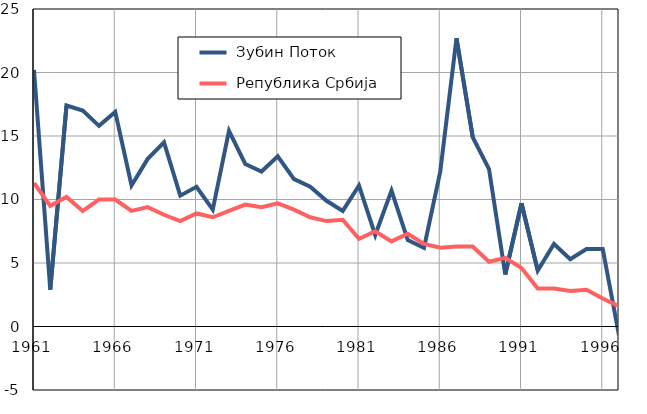
| Category |  Зубин Поток |  Република Србија |
|---|---|---|
| 1961.0 | 20.2 | 11.3 |
| 1962.0 | 2.9 | 9.5 |
| 1963.0 | 17.4 | 10.2 |
| 1964.0 | 17 | 9.1 |
| 1965.0 | 15.8 | 10 |
| 1966.0 | 16.9 | 10 |
| 1967.0 | 11.1 | 9.1 |
| 1968.0 | 13.2 | 9.4 |
| 1969.0 | 14.5 | 8.8 |
| 1970.0 | 10.3 | 8.3 |
| 1971.0 | 11 | 8.9 |
| 1972.0 | 9.2 | 8.6 |
| 1973.0 | 15.4 | 9.1 |
| 1974.0 | 12.8 | 9.6 |
| 1975.0 | 12.2 | 9.4 |
| 1976.0 | 13.4 | 9.7 |
| 1977.0 | 11.6 | 9.2 |
| 1978.0 | 11 | 8.6 |
| 1979.0 | 9.9 | 8.3 |
| 1980.0 | 9.1 | 8.4 |
| 1981.0 | 11.1 | 6.9 |
| 1982.0 | 7.2 | 7.5 |
| 1983.0 | 10.7 | 6.7 |
| 1984.0 | 6.8 | 7.3 |
| 1985.0 | 6.2 | 6.5 |
| 1986.0 | 12.2 | 6.2 |
| 1987.0 | 22.7 | 6.3 |
| 1988.0 | 14.9 | 6.3 |
| 1989.0 | 12.4 | 5.1 |
| 1990.0 | 4.1 | 5.4 |
| 1991.0 | 9.7 | 4.6 |
| 1992.0 | 4.4 | 3 |
| 1993.0 | 6.5 | 3 |
| 1994.0 | 5.3 | 2.8 |
| 1995.0 | 6.1 | 2.9 |
| 1996.0 | 6.1 | 2.2 |
| 1997.0 | -0.7 | 1.6 |